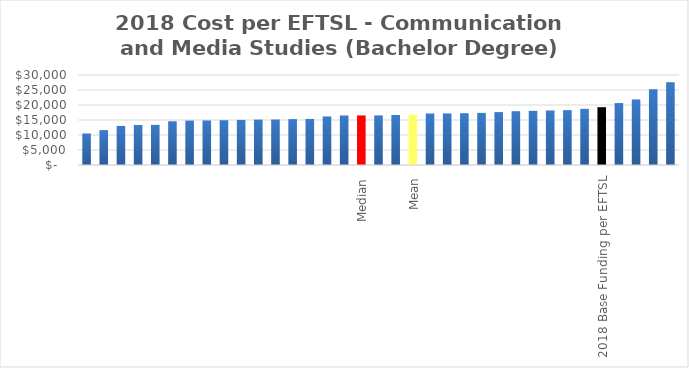
| Category | Series 0 |
|---|---|
|  | 10482.577 |
|  | 11631.627 |
|  | 13027.762 |
|  | 13338.434 |
|  | 13377.955 |
|  | 14579.652 |
|  | 14783.542 |
|  | 14845.77 |
|  | 14919.032 |
|  | 15025.872 |
|  | 15110.968 |
|  | 15143.042 |
|  | 15293.068 |
|  | 15357.11 |
|  | 16187.901 |
|  | 16509.613 |
| Median | 16520.682 |
|  | 16531.75 |
|  | 16668.937 |
| Mean | 16748.272 |
|  | 17166.99 |
|  | 17184.665 |
|  | 17263.931 |
|  | 17365.397 |
|  | 17638.924 |
|  | 17933.901 |
|  | 18052.468 |
|  | 18176.571 |
|  | 18288.204 |
|  | 18718.55 |
| 2018 Base Funding per EFTSL | 19274 |